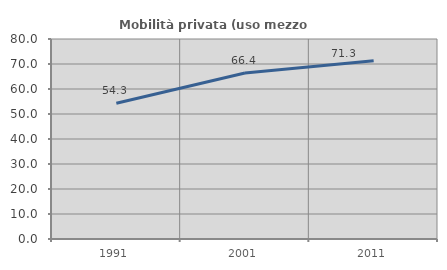
| Category | Mobilità privata (uso mezzo privato) |
|---|---|
| 1991.0 | 54.297 |
| 2001.0 | 66.42 |
| 2011.0 | 71.32 |